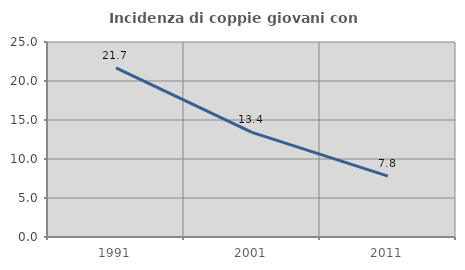
| Category | Incidenza di coppie giovani con figli |
|---|---|
| 1991.0 | 21.675 |
| 2001.0 | 13.415 |
| 2011.0 | 7.81 |